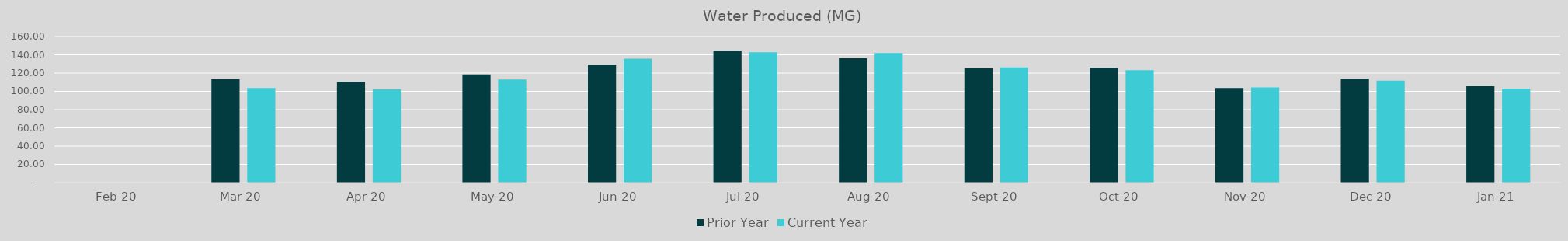
| Category | Prior Year | Current Year |
|---|---|---|
| 43862.0 | 0 | 0 |
| 43891.0 | 113.435 | 103.589 |
| 43922.0 | 110.378 | 102.234 |
| 43952.0 | 118.45 | 112.97 |
| 43983.0 | 129.166 | 135.774 |
| 44013.0 | 144.406 | 142.69 |
| 44044.0 | 136.158 | 141.835 |
| 44075.0 | 125.367 | 126.166 |
| 44105.0 | 125.83 | 123.18 |
| 44136.0 | 103.57 | 104.24 |
| 44166.0 | 113.6 | 111.67 |
| 44197.0 | 105.752 | 103.01 |